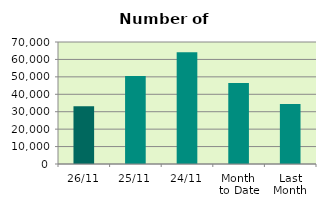
| Category | Series 0 |
|---|---|
| 26/11 | 33090 |
| 25/11 | 50558 |
| 24/11 | 64116 |
| Month 
to Date | 46441.895 |
| Last
Month | 34490.636 |